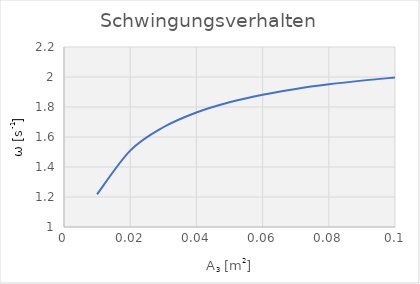
| Category | Series 0 |
|---|---|
| 0.01 | 1.218 |
| 0.02 | 1.509 |
| 0.03 | 1.665 |
| 0.04 | 1.764 |
| 0.05 | 1.832 |
| 0.06 | 1.882 |
| 0.07 | 1.921 |
| 0.08 | 1.951 |
| 0.09 | 1.976 |
| 0.1 | 1.996 |